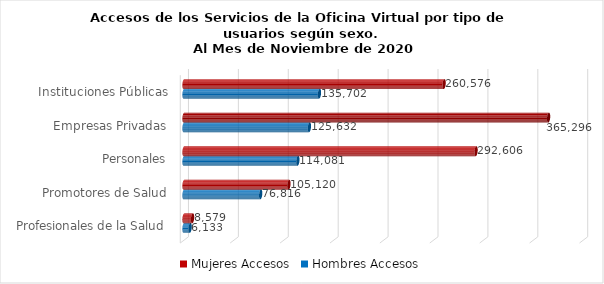
| Category | Mujeres | Hombres |
|---|---|---|
| Instituciones Públicas | 260576 | 135702 |
| Empresas Privadas | 365296 | 125632 |
| Personales | 292606 | 114081 |
| Promotores de Salud | 105120 | 76816 |
| Profesionales de la Salud | 8579 | 6133 |